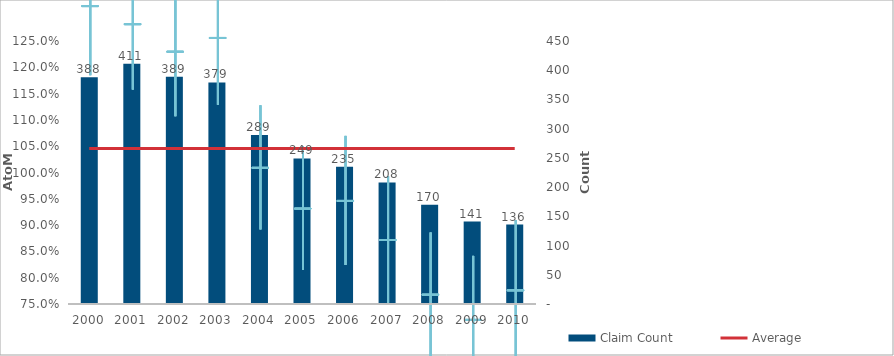
| Category | Claim Count |
|---|---|
| 0 | 388 |
| 1 | 411 |
| 2 | 389 |
| 3 | 379 |
| 4 | 289 |
| 5 | 249 |
| 6 | 235 |
| 7 | 208 |
| 8 | 170 |
| 9 | 141 |
| 10 | 136 |